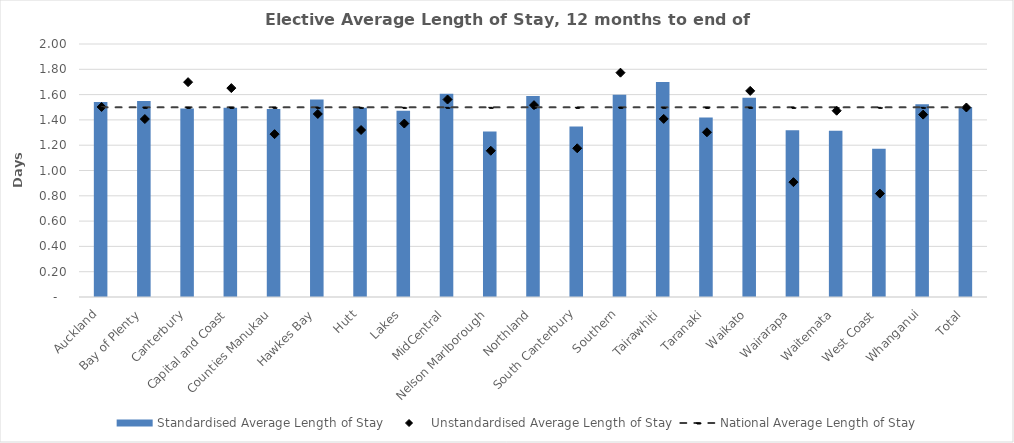
| Category | Standardised Average Length of Stay |
|---|---|
| Auckland | 1.541 |
| Bay of Plenty | 1.549 |
| Canterbury | 1.491 |
| Capital and Coast | 1.495 |
| Counties Manukau | 1.485 |
| Hawkes Bay | 1.561 |
| Hutt | 1.497 |
| Lakes | 1.472 |
| MidCentral | 1.606 |
| Nelson Marlborough | 1.308 |
| Northland | 1.589 |
| South Canterbury | 1.347 |
| Southern | 1.598 |
| Tairawhiti | 1.699 |
| Taranaki | 1.419 |
| Waikato | 1.575 |
| Wairarapa | 1.318 |
| Waitemata | 1.315 |
| West Coast | 1.173 |
| Whanganui | 1.524 |
| Total | 1.499 |